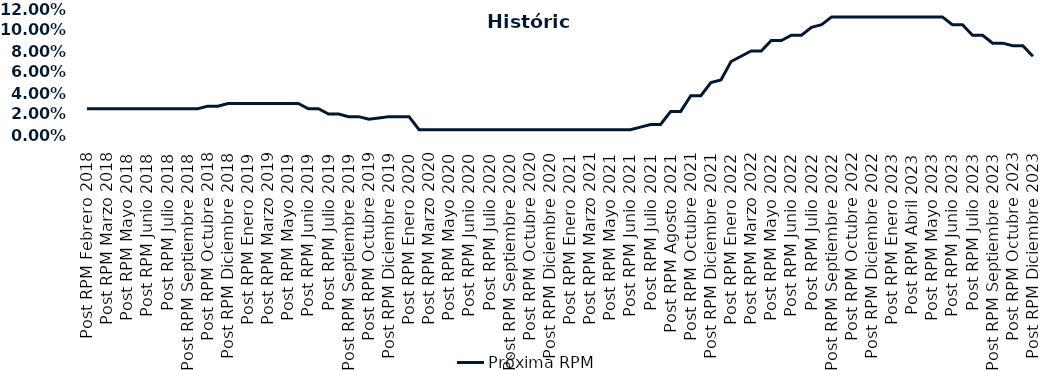
| Category | Próxima RPM |
|---|---|
| Post RPM Febrero 2018 | 0.025 |
| Pre RPM Marzo 2018 | 0.025 |
| Post RPM Marzo 2018 | 0.025 |
| Pre RPM Mayo 2018 | 0.025 |
| Post RPM Mayo 2018 | 0.025 |
| Pre RPM Junio 2018 | 0.025 |
| Post RPM Junio 2018 | 0.025 |
| Pre RPM Julio 2018 | 0.025 |
| Post RPM Julio 2018 | 0.025 |
| Pre RPM Septiembre 2018 | 0.025 |
| Post RPM Septiembre 2018 | 0.025 |
| Pre RPM Octubre 2018 | 0.025 |
| Post RPM Octubre 2018 | 0.028 |
| Pre RPM Diciembre 2018 | 0.028 |
| Post RPM Diciembre 2018 | 0.03 |
| Pre RPM Enero 2019 | 0.03 |
| Post RPM Enero 2019 | 0.03 |
| Pre RPM Marzo 2019 | 0.03 |
| Post RPM Marzo 2019 | 0.03 |
| Pre RPM Mayo 2019 | 0.03 |
| Post RPM Mayo 2019 | 0.03 |
| Pre RPM Junio 2019 | 0.03 |
| Post RPM Junio 2019 | 0.025 |
| Pre RPM Julio 2019 | 0.025 |
| Post RPM Julio 2019 | 0.02 |
| Pre RPM Septiembre 2019 | 0.02 |
| Post RPM Septiembre 2019 | 0.018 |
| Pre RPM Octubre 2019 | 0.018 |
| Post RPM Octubre 2019 | 0.015 |
| Pre RPM Diciembre 2019 | 0.016 |
| Post RPM Diciembre 2019 | 0.018 |
| Pre RPM Enero 2020 | 0.018 |
| Post RPM Enero 2020 | 0.018 |
| Pre RPM Marzo 2020 | 0.005 |
| Post RPM Marzo 2020 | 0.005 |
| Pre RPM Mayo 2020 | 0.005 |
| Post RPM Mayo 2020 | 0.005 |
| Pre RPM Junio 2020 | 0.005 |
| Post RPM Junio 2020 | 0.005 |
| Pre RPM Julio 2020 | 0.005 |
| Post RPM Julio 2020 | 0.005 |
| Pre RPM Septiembre 2020 | 0.005 |
| Post RPM Septiembre 2020 | 0.005 |
| Pre RPM Octubre 2020 | 0.005 |
| Post RPM Octubre 2020 | 0.005 |
| Pre RPM Diciembre 2020 | 0.005 |
| Post RPM Diciembre 2020 | 0.005 |
| Pre RPM Enero 2021 | 0.005 |
| Post RPM Enero 2021 | 0.005 |
| Pre RPM Marzo 2021 | 0.005 |
| Post RPM Marzo 2021 | 0.005 |
| Pre RPM Mayo 2021 | 0.005 |
| Post RPM Mayo 2021 | 0.005 |
| Pre RPM Junio 2021 | 0.005 |
| Post RPM Junio 2021 | 0.005 |
| Pre RPM Julio 2021 | 0.008 |
| Post RPM Julio 2021 | 0.01 |
| Pre RPM Agosto 2021 | 0.01 |
| Post RPM Agosto 2021 | 0.022 |
| Pre RPM Octubre 2021 | 0.022 |
| Post RPM Octubre 2021 | 0.038 |
| Pre RPM Diciembre 2021 | 0.038 |
| Post RPM Diciembre 2021 | 0.05 |
| Pre RPM Enero 2022 | 0.052 |
| Post RPM Enero 2022 | 0.07 |
| Pre RPM Marzo 2022 | 0.075 |
| Post RPM Marzo 2022 | 0.08 |
| Pre RPM Mayo 2022 | 0.08 |
| Post RPM Mayo 2022 | 0.09 |
| Pre RPM Junio 2022 | 0.09 |
| Post RPM Junio 2022 | 0.095 |
| Pre RPM Julio 2022 | 0.095 |
| Post RPM Julio 2022 | 0.102 |
| Pre RPM Septiembre 2022 | 0.105 |
| Post RPM Septiembre 2022 | 0.112 |
| Pre RPM Octubre 2022 | 0.112 |
| Post RPM Octubre 2022 | 0.112 |
| Pre RPM Diciembre 2022 | 0.112 |
| Post RPM Diciembre 2022 | 0.112 |
| Pre RPM Enero 2023 | 0.112 |
| Post RPM Enero 2023 | 0.112 |
| Pre RPM Abril 2023 | 0.112 |
| Post RPM Abril 2023 | 0.112 |
| Pre RPM Mayo 2023 | 0.112 |
| Post RPM Mayo 2023 | 0.112 |
| Pre RPM Junio 2023 | 0.112 |
| Post RPM Junio 2023 | 0.105 |
| Pre RPM Julio 2023 | 0.105 |
| Post RPM Julio 2023 | 0.095 |
| Pre RPM Septiembre 2023 | 0.095 |
| Post RPM Septiembre 2023 | 0.088 |
| Pre RPM Octubre 2023 | 0.088 |
| Post RPM Octubre 2023 | 0.085 |
| Pre RPM Diciembre 2023 | 0.085 |
| Post RPM Diciembre 2023 | 0.075 |